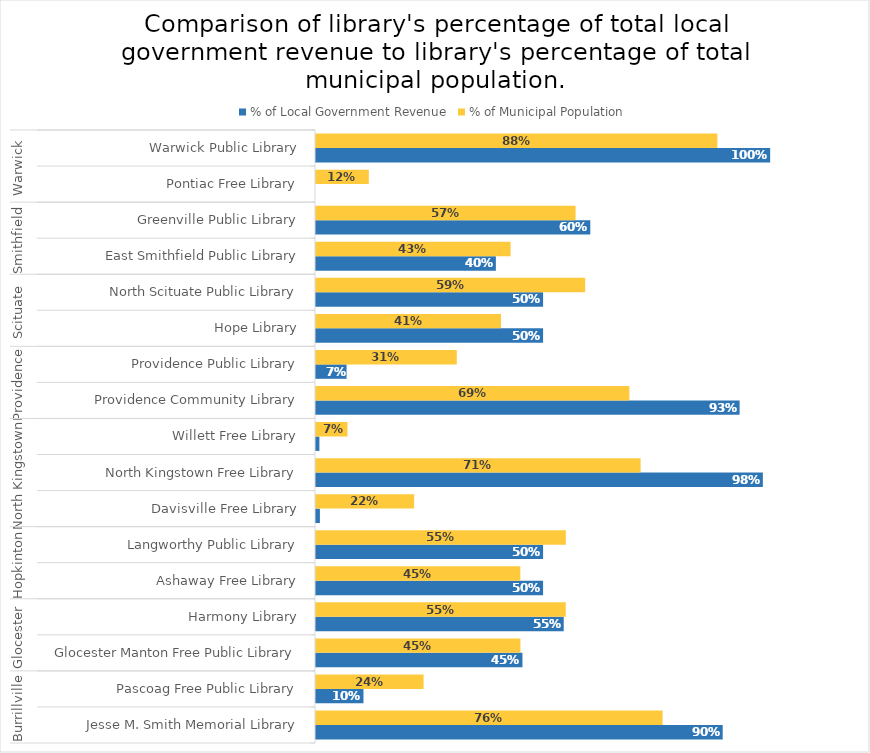
| Category | % of Local Government Revenue | % of Municipal Population |
|---|---|---|
| 0 | 0.895 | 0.763 |
| 1 | 0.105 | 0.237 |
| 2 | 0.455 | 0.45 |
| 3 | 0.545 | 0.55 |
| 4 | 0.5 | 0.45 |
| 5 | 0.5 | 0.55 |
| 6 | 0.009 | 0.216 |
| 7 | 0.984 | 0.715 |
| 8 | 0.007 | 0.069 |
| 9 | 0.933 | 0.69 |
| 10 | 0.067 | 0.31 |
| 11 | 0.5 | 0.407 |
| 12 | 0.5 | 0.593 |
| 13 | 0.396 | 0.428 |
| 14 | 0.604 | 0.572 |
| 15 | 0 | 0.116 |
| 16 | 1 | 0.884 |